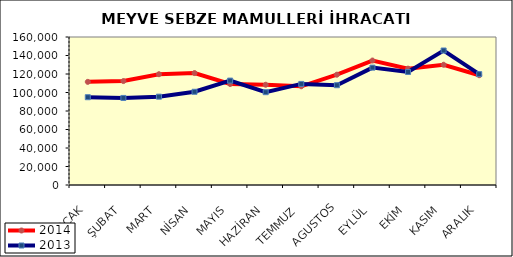
| Category | 2014 | 2013 |
|---|---|---|
| OCAK | 111498.515 | 94905.948 |
| ŞUBAT | 112348.275 | 94116.08 |
| MART | 119768.885 | 95501.997 |
| NİSAN | 121026.583 | 100788.325 |
| MAYIS | 109196.351 | 112864.61 |
| HAZİRAN | 108378.8 | 100335.581 |
| TEMMUZ | 106723.634 | 109284.27 |
| AGUSTOS | 119251.822 | 107879.761 |
| EYLÜL | 134559.059 | 126891.688 |
| EKİM | 125784.903 | 122192.475 |
| KASIM | 130007.206 | 145394.356 |
| ARALIK | 118682.465 | 119836.911 |